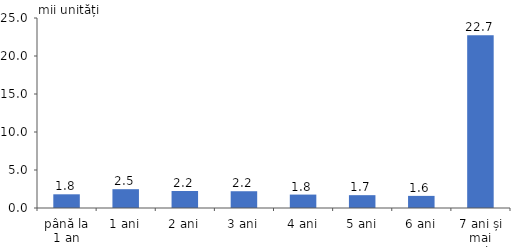
| Category | Series 0 |
|---|---|
| până la 1 an | 1.802 |
| 1 ani | 2.475 |
| 2 ani | 2.239 |
| 3 ani | 2.206 |
| 4 ani | 1.766 |
| 5 ani | 1.688 |
| 6 ani | 1.594 |
| 7 ani și mai mulți | 22.723 |